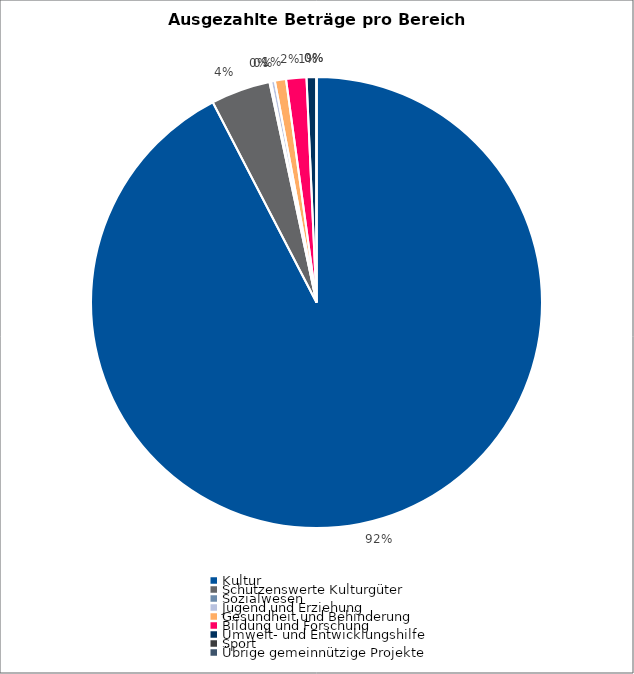
| Category | Series 0 |
|---|---|
| Kultur | 15262440.68 |
| Schützenswerte Kulturgüter | 703861.11 |
| Sozialwesen | 18000 |
| Jugend und Erziehung | 46000 |
| Gesundheit und Behinderung | 132000 |
| Bildung und Forschung | 240000 |
| Umwelt- und Entwicklungshilfe | 117000 |
| Sport | 0 |
| Übrige gemeinnützige Projekte | 0 |